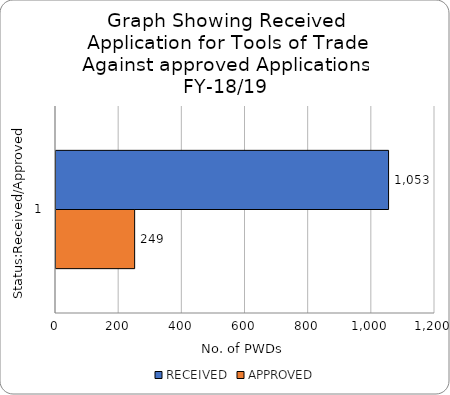
| Category | RECEIVED | APPROVED |
|---|---|---|
| 0 | 1053 | 249 |